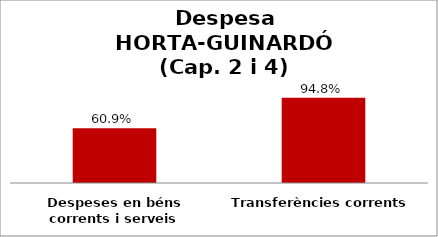
| Category | Series 0 |
|---|---|
| Despeses en béns corrents i serveis | 0.609 |
| Transferències corrents | 0.948 |